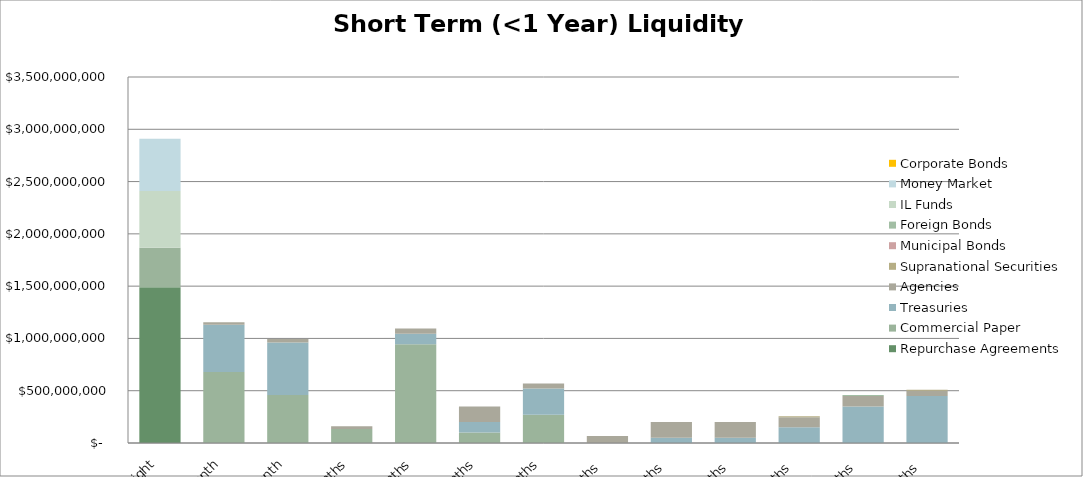
| Category | Repurchase Agreements | Commercial Paper | Treasuries | Agencies | Supranational Securities | Municipal Bonds | Foreign Bonds | IL Funds | Money Market | Corporate Bonds |
|---|---|---|---|---|---|---|---|---|---|---|
| Overnight | 1490225000 | 376300000 | 0 | 0 | 0 | 0 | 0 | 543000000 | 500000000 | 0 |
| 1 Month | 0 | 680000000 | 450000000 | 25000000 | 0 | 0 | 0 | 0 | 0 | 0 |
| 2 Month | 0 | 460000000 | 500000000 | 34000000 | 0 | 0 | 0 | 0 | 0 | 0 |
| 3 Months | 0 | 135000000 | 0 | 25000000 | 0 | 0 | 0 | 0 | 0 | 0 |
| 4 Months | 0 | 945000000 | 100000000 | 50000000 | 0 | 0 | 0 | 0 | 0 | 0 |
| 5 Months | 0 | 100000000 | 100000000 | 150000000 | 0 | 0 | 0 | 0 | 0 | 0 |
| 6 Months | 0 | 270000000 | 250000000 | 50000000 | 0 | 0 | 0 | 0 | 0 | 0 |
| 7 Months  | 0 | 0 | 0 | 66000000 | 0 | 0 | 0 | 0 | 0 | 0 |
| 8 Months  | 0 | 0 | 50000000 | 150000000 | 0 | 0 | 0 | 0 | 0 | 0 |
| 9 Months  | 0 | 0 | 50000000 | 150000000 | 0 | 0 | 0 | 0 | 0 | 0 |
| 10 Months  | 0 | 0 | 150000000 | 96000000 | 10000000 | 0 | 0 | 0 | 0 | 0 |
| 11 Months  | 0 | 0 | 350000000 | 100002000 | 0 | 0 | 10000000 | 0 | 0 | 0 |
| 12 Months  | 0 | 0 | 450000000 | 50000000 | 10000000 | 0 | 0 | 0 | 0 | 0 |